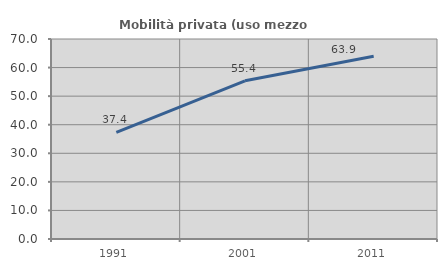
| Category | Mobilità privata (uso mezzo privato) |
|---|---|
| 1991.0 | 37.356 |
| 2001.0 | 55.373 |
| 2011.0 | 63.948 |